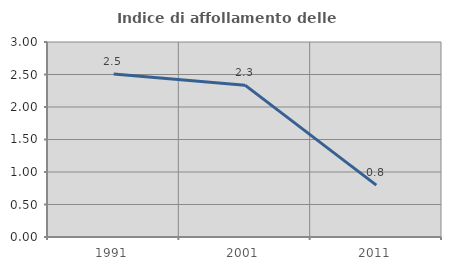
| Category | Indice di affollamento delle abitazioni  |
|---|---|
| 1991.0 | 2.509 |
| 2001.0 | 2.336 |
| 2011.0 | 0.797 |